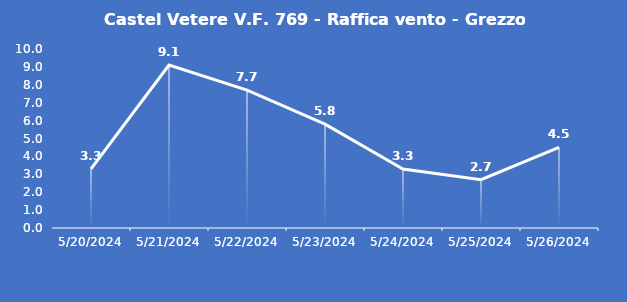
| Category | Castel Vetere V.F. 769 - Raffica vento - Grezzo (m/s) |
|---|---|
| 5/20/24 | 3.3 |
| 5/21/24 | 9.1 |
| 5/22/24 | 7.7 |
| 5/23/24 | 5.8 |
| 5/24/24 | 3.3 |
| 5/25/24 | 2.7 |
| 5/26/24 | 4.5 |